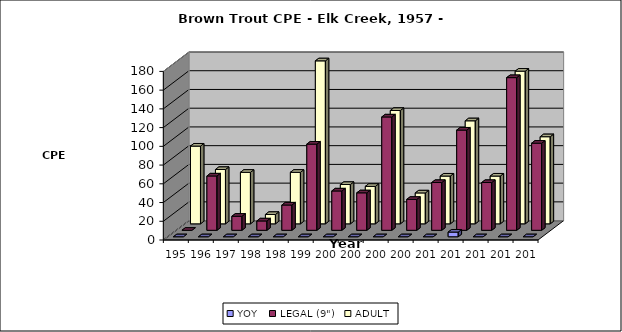
| Category | YOY | LEGAL (9") | ADULT |
|---|---|---|---|
| 1957.0 | 0 | 0 | 83 |
| 1967.0 | 0 | 58 | 58 |
| 1979.0 | 0 | 15 | 55 |
| 1988.0 | 0 | 10 | 10 |
| 1989.0 | 0 | 27 | 55 |
| 1994.0 | 0 | 92 | 174 |
| 2001.0 | 0 | 42 | 42 |
| 2007.0 | 0 | 40 | 40 |
| 2008.0 | 0 | 121 | 121 |
| 2009.0 | 0 | 33 | 33 |
| 2010.0 | 0 | 51 | 51 |
| 2011.0 | 5 | 107 | 110 |
| 2012.0 | 0 | 51 | 51 |
| 2013.0 | 0 | 163 | 163 |
| 2014.0 | 0 | 93 | 93 |